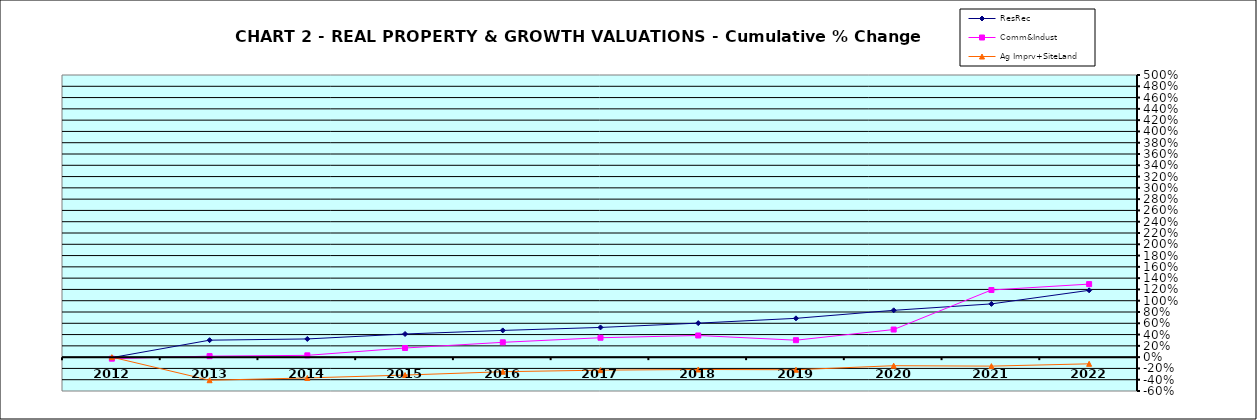
| Category | ResRec | Comm&Indust | Ag Imprv+SiteLand |
|---|---|---|---|
| 2012.0 | -0.009 | -0.027 | 0 |
| 2013.0 | 0.301 | 0.018 | -0.409 |
| 2014.0 | 0.323 | 0.032 | -0.369 |
| 2015.0 | 0.41 | 0.162 | -0.317 |
| 2016.0 | 0.474 | 0.263 | -0.259 |
| 2017.0 | 0.526 | 0.344 | -0.231 |
| 2018.0 | 0.603 | 0.384 | -0.219 |
| 2019.0 | 0.688 | 0.3 | -0.223 |
| 2020.0 | 0.83 | 0.489 | -0.152 |
| 2021.0 | 0.944 | 1.19 | -0.159 |
| 2022.0 | 1.184 | 1.294 | -0.118 |